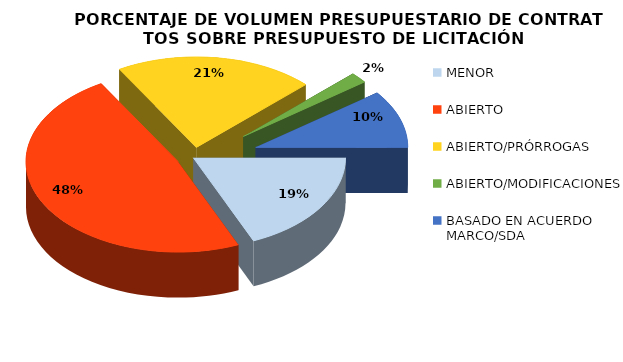
| Category |  PORCENTAJE DE VOLUMEN PRESUPUESTARIO DE CONTRATOS A TRAVÉS DE LOS PROCEDIMIENTOS DE ADJUDICACIÓN |
|---|---|
| MENOR | 0.185 |
| ABIERTO | 0.48 |
| ABIERTO/PRÓRROGAS | 0.212 |
| ABIERTO/MODIFICACIONES | 0.019 |
| BASADO EN ACUERDO MARCO/SDA | 0.103 |